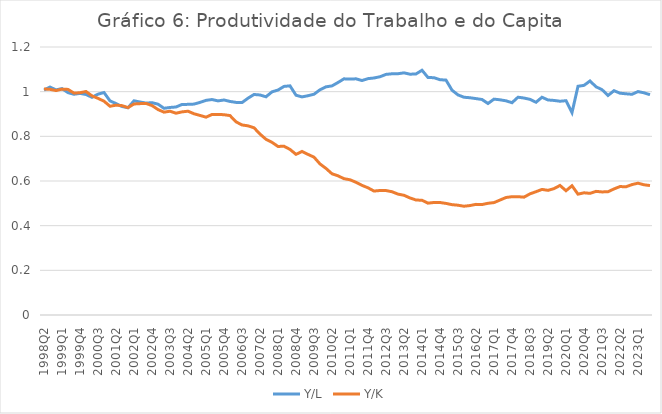
| Category | Y/L |
|---|---|
| 1998Q2 | 1.007 |
| 1998Q3 | 1.021 |
| 1998Q4 | 1.008 |
| 1999Q1 | 1.014 |
| 1999Q2 | 0.996 |
| 1999Q3 | 0.988 |
| 1999Q4 | 0.992 |
| 2000Q1 | 0.987 |
| 2000Q2 | 0.975 |
| 2000Q3 | 0.989 |
| 2000Q4 | 0.996 |
| 2001Q1 | 0.959 |
| 2001Q2 | 0.947 |
| 2001Q3 | 0.934 |
| 2001Q4 | 0.928 |
| 2002Q1 | 0.959 |
| 2002Q2 | 0.954 |
| 2002Q3 | 0.949 |
| 2002Q4 | 0.951 |
| 2003Q1 | 0.944 |
| 2003Q2 | 0.926 |
| 2003Q3 | 0.929 |
| 2003Q4 | 0.931 |
| 2004Q1 | 0.943 |
| 2004Q2 | 0.943 |
| 2004Q3 | 0.944 |
| 2004Q4 | 0.952 |
| 2005Q1 | 0.961 |
| 2005Q2 | 0.965 |
| 2005Q3 | 0.959 |
| 2005Q4 | 0.963 |
| 2006Q1 | 0.956 |
| 2006Q2 | 0.952 |
| 2006Q3 | 0.951 |
| 2006Q4 | 0.971 |
| 2007Q1 | 0.987 |
| 2007Q2 | 0.985 |
| 2007Q3 | 0.977 |
| 2007Q4 | 0.999 |
| 2008Q1 | 1.007 |
| 2008Q2 | 1.024 |
| 2008Q3 | 1.026 |
| 2008Q4 | 0.984 |
| 2009Q1 | 0.976 |
| 2009Q2 | 0.982 |
| 2009Q3 | 0.988 |
| 2009Q4 | 1.009 |
| 2010Q1 | 1.022 |
| 2010Q2 | 1.026 |
| 2010Q3 | 1.041 |
| 2010Q4 | 1.057 |
| 2011Q1 | 1.056 |
| 2011Q2 | 1.058 |
| 2011Q3 | 1.05 |
| 2011Q4 | 1.058 |
| 2012Q1 | 1.061 |
| 2012Q2 | 1.067 |
| 2012Q3 | 1.077 |
| 2012Q4 | 1.08 |
| 2013Q1 | 1.08 |
| 2013Q2 | 1.084 |
| 2013Q3 | 1.078 |
| 2013Q4 | 1.079 |
| 2014Q1 | 1.096 |
| 2014Q2 | 1.064 |
| 2014Q3 | 1.063 |
| 2014Q4 | 1.054 |
| 2015Q1 | 1.052 |
| 2015Q2 | 1.007 |
| 2015Q3 | 0.985 |
| 2015Q4 | 0.975 |
| 2016Q1 | 0.973 |
| 2016Q2 | 0.969 |
| 2016Q3 | 0.965 |
| 2016Q4 | 0.947 |
| 2017Q1 | 0.967 |
| 2017Q2 | 0.964 |
| 2017Q3 | 0.959 |
| 2017Q4 | 0.951 |
| 2018Q1 | 0.975 |
| 2018Q2 | 0.971 |
| 2018Q3 | 0.966 |
| 2018Q4 | 0.953 |
| 2019Q1 | 0.975 |
| 2019Q2 | 0.963 |
| 2019Q3 | 0.961 |
| 2019Q4 | 0.957 |
| 2020Q1 | 0.96 |
| 2020Q2 | 0.906 |
| 2020Q3 | 1.024 |
| 2020Q4 | 1.028 |
| 2021Q1 | 1.048 |
| 2021Q2 | 1.022 |
| 2021Q3 | 1.009 |
| 2021Q4 | 0.983 |
| 2022Q1 | 1.004 |
| 2022Q2 | 0.993 |
| 2022Q3 | 0.99 |
| 2022Q4 | 0.988 |
| 2023Q1 | 1 |
| 2023Q2 | 0.995 |